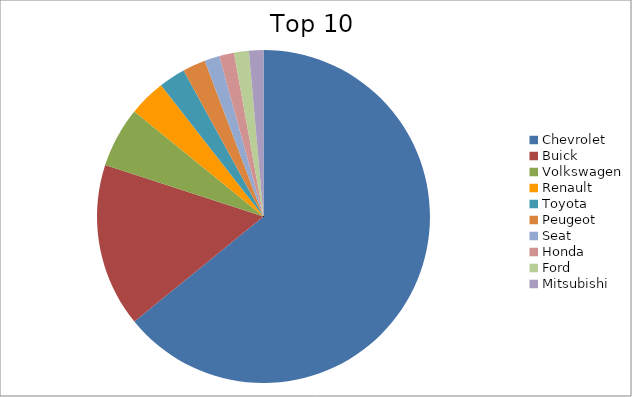
| Category | Series 0 |
|---|---|
| Chevrolet | 64.13 |
| Buick | 15.88 |
| Volkswagen | 5.86 |
| Renault | 3.58 |
| Toyota | 2.58 |
| Peugeot | 2.23 |
| Seat | 1.46 |
| Honda | 1.44 |
| Ford | 1.44 |
| Mitsubishi | 1.4 |